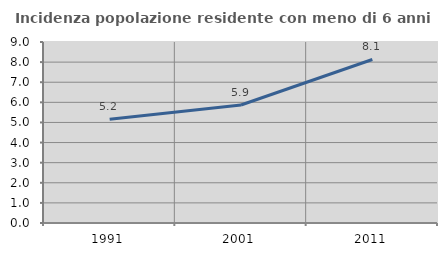
| Category | Incidenza popolazione residente con meno di 6 anni |
|---|---|
| 1991.0 | 5.161 |
| 2001.0 | 5.867 |
| 2011.0 | 8.132 |